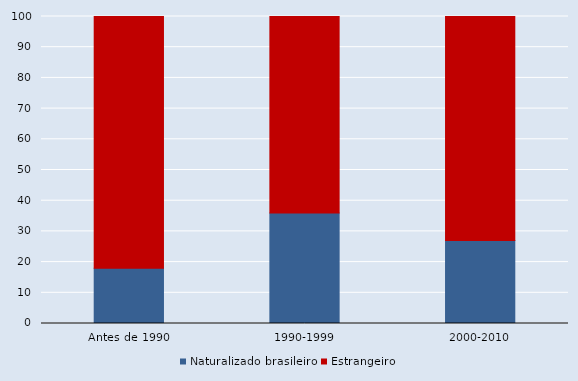
| Category | Naturalizado brasileiro | Estrangeiro |
|---|---|---|
| Antes de 1990 | 18 | 82 |
| 1990-1999 | 36 | 64 |
| 2000-2010 | 27 | 73 |